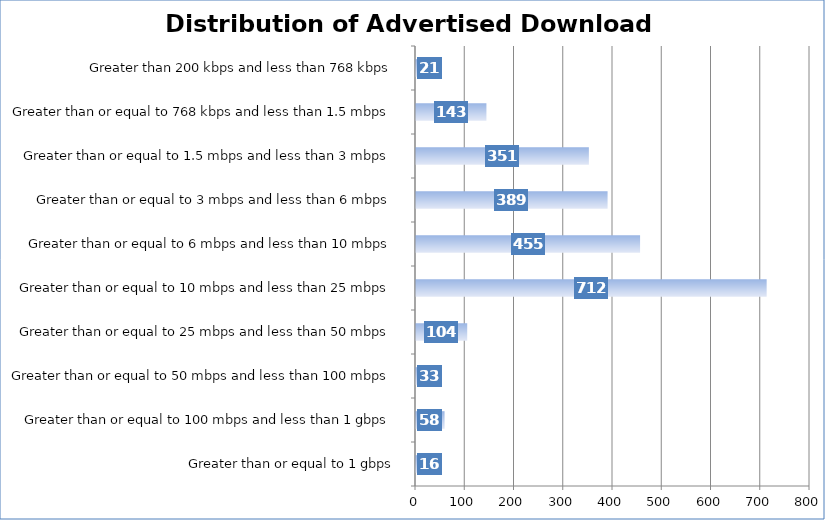
| Category | Count |
|---|---|
| Greater than or equal to 1 gbps | 16 |
| Greater than or equal to 100 mbps and less than 1 gbps | 58 |
| Greater than or equal to 50 mbps and less than 100 mbps | 33 |
| Greater than or equal to 25 mbps and less than 50 mbps | 104 |
| Greater than or equal to 10 mbps and less than 25 mbps | 712 |
| Greater than or equal to 6 mbps and less than 10 mbps | 455 |
| Greater than or equal to 3 mbps and less than 6 mbps | 389 |
| Greater than or equal to 1.5 mbps and less than 3 mbps | 351 |
| Greater than or equal to 768 kbps and less than 1.5 mbps | 143 |
| Greater than 200 kbps and less than 768 kbps | 21 |